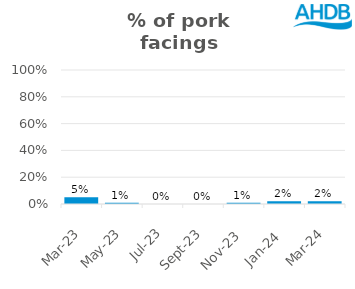
| Category | Pork |
|---|---|
| 2023-03-01 | 0.05 |
| 2023-05-01 | 0.01 |
| 2023-07-01 | 0 |
| 2023-09-01 | 0 |
| 2023-11-01 | 0.01 |
| 2024-01-01 | 0.02 |
| 2024-03-01 | 0.02 |